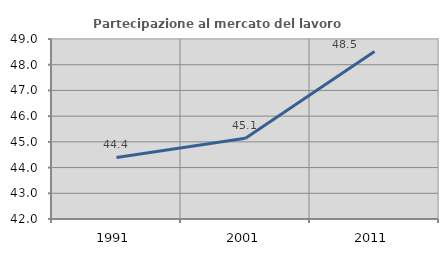
| Category | Partecipazione al mercato del lavoro  femminile |
|---|---|
| 1991.0 | 44.396 |
| 2001.0 | 45.139 |
| 2011.0 | 48.513 |